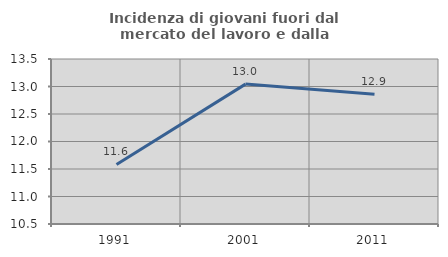
| Category | Incidenza di giovani fuori dal mercato del lavoro e dalla formazione  |
|---|---|
| 1991.0 | 11.583 |
| 2001.0 | 13.043 |
| 2011.0 | 12.857 |